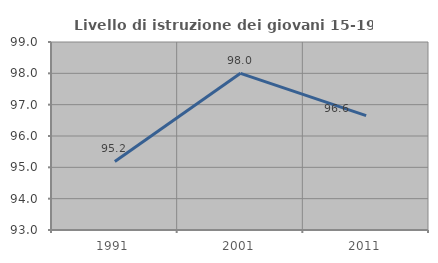
| Category | Livello di istruzione dei giovani 15-19 anni |
|---|---|
| 1991.0 | 95.187 |
| 2001.0 | 98 |
| 2011.0 | 96.648 |